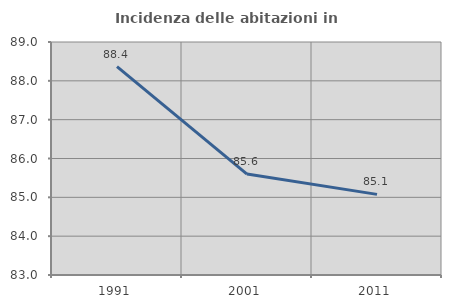
| Category | Incidenza delle abitazioni in proprietà  |
|---|---|
| 1991.0 | 88.366 |
| 2001.0 | 85.6 |
| 2011.0 | 85.076 |